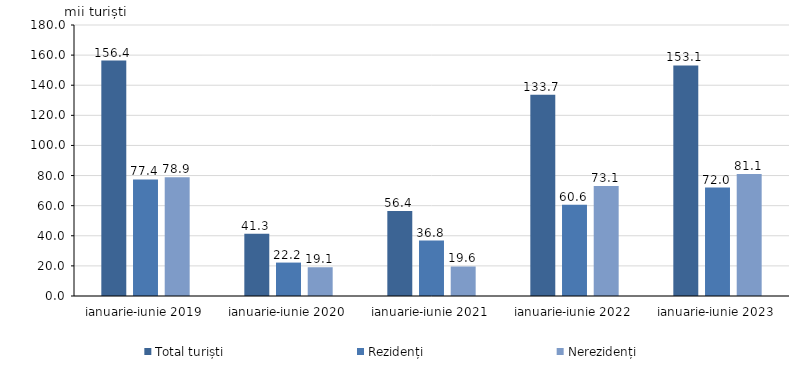
| Category | Total turiști | Rezidenți | Nerezidenți |
|---|---|---|---|
| ianuarie-iunie 2019 | 156.4 | 77.4 | 78.9 |
| ianuarie-iunie 2020 | 41.3 | 22.2 | 19.1 |
| ianuarie-iunie 2021 | 56.4 | 36.8 | 19.6 |
| ianuarie-iunie 2022 | 133.7 | 60.6 | 73.1 |
| ianuarie-iunie 2023 | 153.1 | 72 | 81.1 |